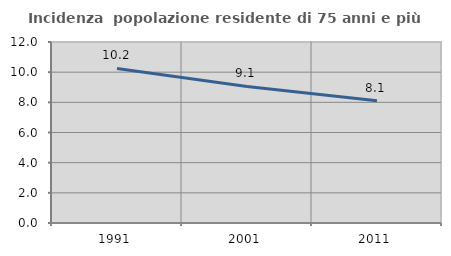
| Category | Incidenza  popolazione residente di 75 anni e più |
|---|---|
| 1991.0 | 10.244 |
| 2001.0 | 9.053 |
| 2011.0 | 8.101 |